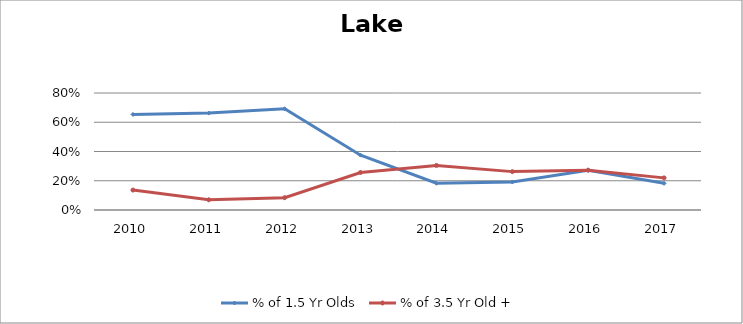
| Category | % of 1.5 Yr Olds | % of 3.5 Yr Old + |
|---|---|---|
| 2010.0 | 0.653 | 0.136 |
| 2011.0 | 0.663 | 0.07 |
| 2012.0 | 0.692 | 0.084 |
| 2013.0 | 0.375 | 0.257 |
| 2014.0 | 0.183 | 0.305 |
| 2015.0 | 0.191 | 0.262 |
| 2016.0 | 0.272 | 0.272 |
| 2017.0 | 0.182 | 0.22 |